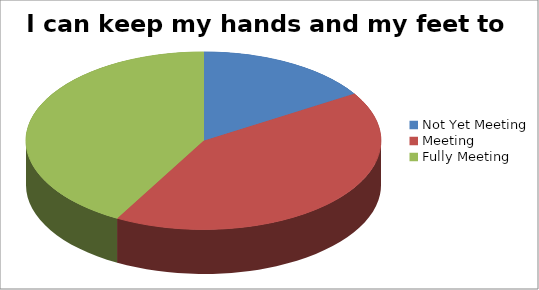
| Category | I can keep my hands and my feet to myself |
|---|---|
| Not Yet Meeting | 5 |
| Meeting | 13 |
| Fully Meeting | 13 |